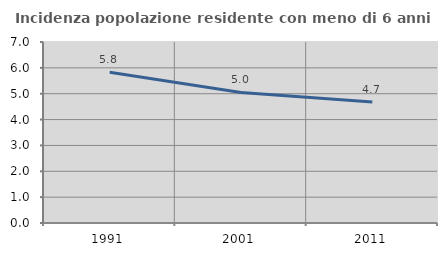
| Category | Incidenza popolazione residente con meno di 6 anni |
|---|---|
| 1991.0 | 5.826 |
| 2001.0 | 5.049 |
| 2011.0 | 4.677 |